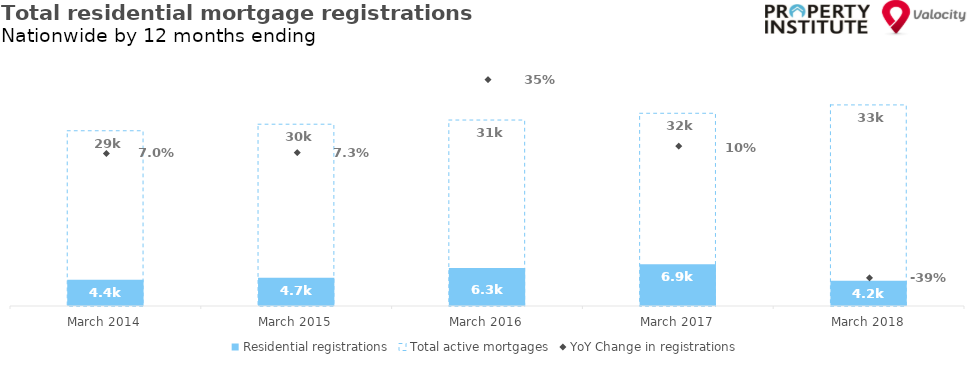
| Category | Residential registrations | Total active mortgages |
|---|---|---|
| 2014-03-01 | 4368 | 29087 |
| 2015-03-01 | 4685 | 30172 |
| 2016-03-01 | 6305 | 30866 |
| 2017-03-01 | 6916 | 31989 |
| 2018-03-01 | 4185 | 33375 |